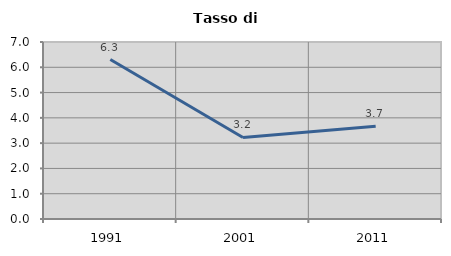
| Category | Tasso di disoccupazione   |
|---|---|
| 1991.0 | 6.306 |
| 2001.0 | 3.226 |
| 2011.0 | 3.67 |